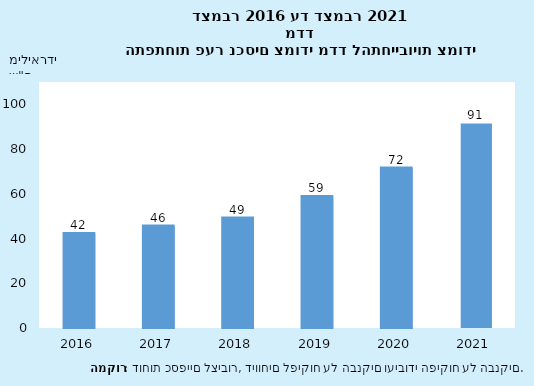
| Category | Series 0 |
|---|---|
| 2016-12-31 | 42.275 |
| 2017-12-31 | 45.588 |
| 2018-12-31 | 49.155 |
| 2019-12-31 | 58.807 |
| 2020-12-31 | 71.536 |
| 2021-12-31 | 91.461 |